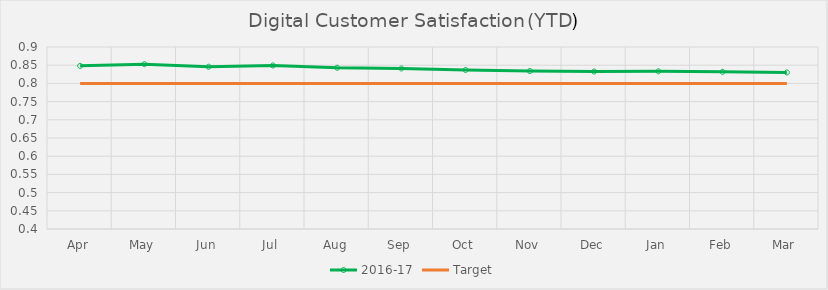
| Category | 2016-17 | Target |
|---|---|---|
| Apr | 0.848 | 0.8 |
| May | 0.853 | 0.8 |
| Jun | 0.846 | 0.8 |
| Jul | 0.849 | 0.8 |
| Aug | 0.843 | 0.8 |
| Sep | 0.841 | 0.8 |
| Oct | 0.837 | 0.8 |
| Nov | 0.834 | 0.8 |
| Dec | 0.833 | 0.8 |
| Jan | 0.833 | 0.8 |
| Feb | 0.832 | 0.8 |
| Mar | 0.83 | 0.8 |